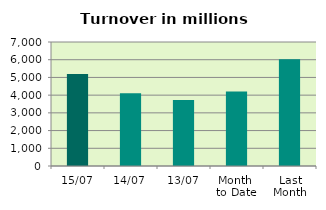
| Category | Series 0 |
|---|---|
| 15/07 | 5197.653 |
| 14/07 | 4110.513 |
| 13/07 | 3727.138 |
| Month 
to Date | 4206.289 |
| Last
Month | 6026.772 |